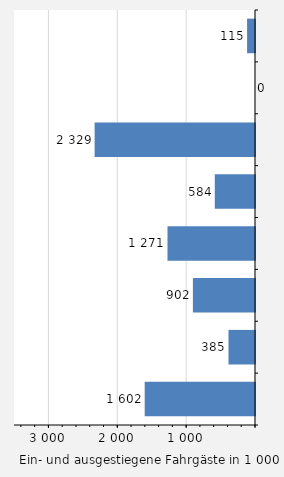
| Category | Fahrgäste |
|---|---|
| Lübeck | 115 |
| Brunsbüttel | 0 |
| Puttgarden / Fehmarn | 2329 |
| Kiel | 584 |
| Dagebüll | 1271 |
| Föhr | 902 |
| List / Sylt | 385 |
| Sonstige Häfen | 1602 |